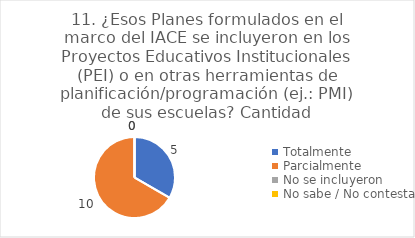
| Category | 11. ¿Esos Planes formulados en el marco del IACE se incluyeron en los Proyectos Educativos Institucionales (PEI) o en otras herramientas de planificación/programación (ej.: PMI) de sus escuelas? |
|---|---|
| Totalmente  | 0.333 |
| Parcialmente  | 0.667 |
| No se incluyeron  | 0 |
| No sabe / No contesta | 0 |